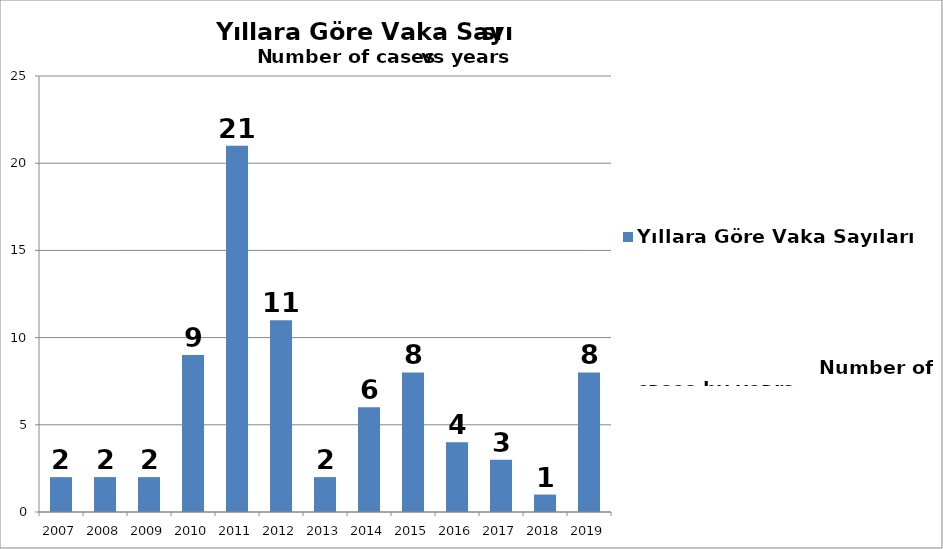
| Category | Yıllara Göre Vaka Sayıları                                                                                                                                                                                                                                      |
|---|---|
| 2007.0 | 2 |
| 2008.0 | 2 |
| 2009.0 | 2 |
| 2010.0 | 9 |
| 2011.0 | 21 |
| 2012.0 | 11 |
| 2013.0 | 2 |
| 2014.0 | 6 |
| 2015.0 | 8 |
| 2016.0 | 4 |
| 2017.0 | 3 |
| 2018.0 | 1 |
| 2019.0 | 8 |